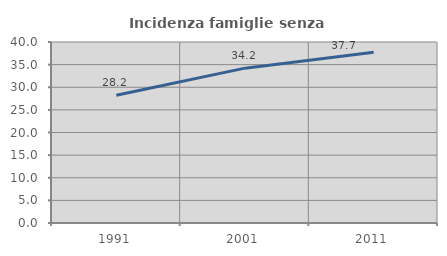
| Category | Incidenza famiglie senza nuclei |
|---|---|
| 1991.0 | 28.235 |
| 2001.0 | 34.224 |
| 2011.0 | 37.715 |